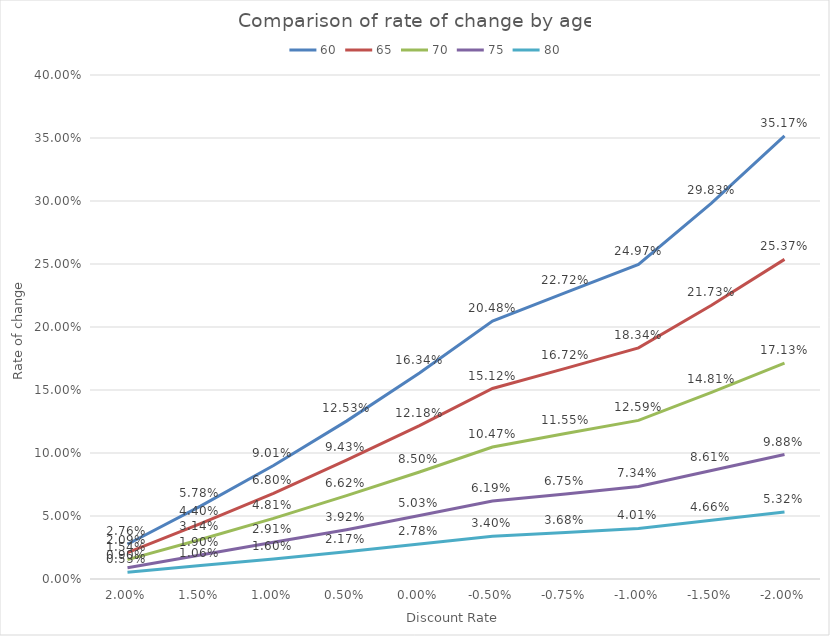
| Category | 60 | 65 | 70 | 75 | 80 |
|---|---|---|---|---|---|
| 0.02 | 0.028 | 0.021 | 0.015 | 0.009 | 0.005 |
| 0.015 | 0.058 | 0.044 | 0.031 | 0.019 | 0.011 |
| 0.01 | 0.09 | 0.068 | 0.048 | 0.029 | 0.016 |
| 0.005 | 0.125 | 0.094 | 0.066 | 0.039 | 0.022 |
| 0.0 | 0.163 | 0.122 | 0.085 | 0.05 | 0.028 |
| -0.005 | 0.205 | 0.151 | 0.105 | 0.062 | 0.034 |
| -0.0075 | 0.227 | 0.167 | 0.116 | 0.068 | 0.037 |
| -0.01 | 0.25 | 0.183 | 0.126 | 0.073 | 0.04 |
| -0.015 | 0.298 | 0.217 | 0.148 | 0.086 | 0.047 |
| -0.02 | 0.352 | 0.254 | 0.171 | 0.099 | 0.053 |